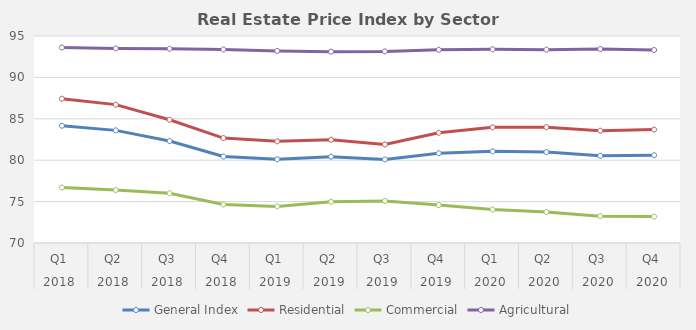
| Category | General Index | Residential | Commercial | Agricultural |
|---|---|---|---|---|
| 0 | 84.16 | 87.43 | 76.7 | 93.61 |
| 1 | 83.603 | 86.713 | 76.403 | 93.5 |
| 2 | 82.31 | 84.883 | 76.01 | 93.45 |
| 3 | 80.443 | 82.67 | 74.65 | 93.37 |
| 4 | 80.11 | 82.277 | 74.417 | 93.203 |
| 5 | 80.427 | 82.473 | 74.983 | 93.11 |
| 6 | 80.093 | 81.9 | 75.083 | 93.14 |
| 7 | 80.833 | 83.32 | 74.577 | 93.33 |
| 8 | 81.07 | 83.973 | 74.047 | 93.397 |
| 9 | 80.977 | 83.99 | 73.74 | 93.353 |
| 10 | 80.538 | 83.562 | 73.242 | 93.424 |
| 11 | 80.6 | 83.696 | 73.187 | 93.307 |